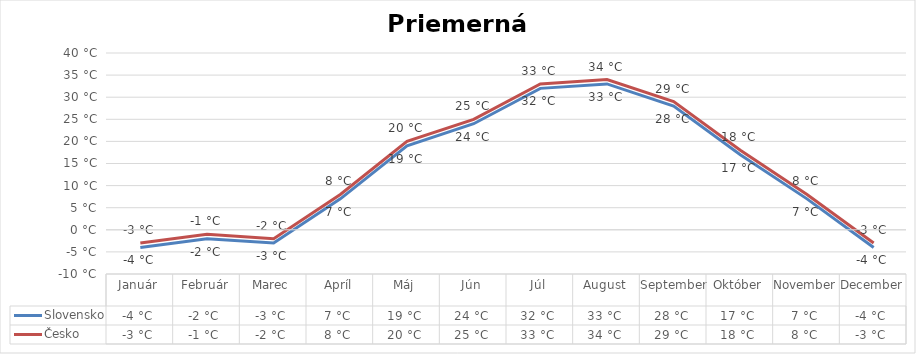
| Category | Slovensko | Česko |
|---|---|---|
| Január | -4 | -3 |
| Február | -2 | -1 |
| Marec | -3 | -2 |
| Apríl | 7 | 8 |
| Máj | 19 | 20 |
| Jún | 24 | 25 |
| Júl | 32 | 33 |
| August | 33 | 34 |
| September | 28 | 29 |
| Október | 17 | 18 |
| November | 7 | 8 |
| December | -4 | -3 |